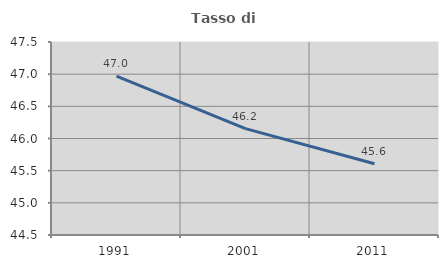
| Category | Tasso di occupazione   |
|---|---|
| 1991.0 | 46.97 |
| 2001.0 | 46.154 |
| 2011.0 | 45.608 |